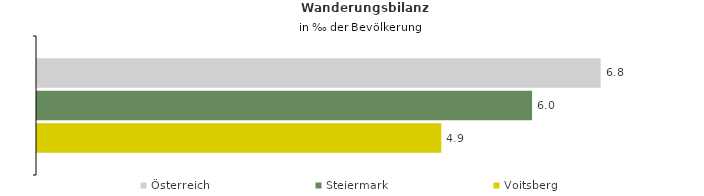
| Category | Österreich | Steiermark | Voitsberg |
|---|---|---|---|
| Wanderungsrate in ‰ der Bevölkerung, Periode 2018-2022 | 6.822 | 5.992 | 4.894 |